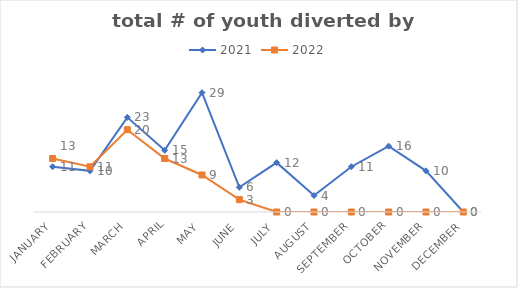
| Category | 2021 | 2022 |
|---|---|---|
| January | 11 | 13 |
| February | 10 | 11 |
| March | 23 | 20 |
| April | 15 | 13 |
| May | 29 | 9 |
| June | 6 | 3 |
| July | 12 | 0 |
| August | 4 | 0 |
| September | 11 | 0 |
| October | 16 | 0 |
| November | 10 | 0 |
| December | 0 | 0 |